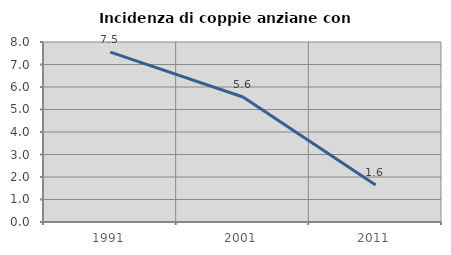
| Category | Incidenza di coppie anziane con figli |
|---|---|
| 1991.0 | 7.547 |
| 2001.0 | 5.556 |
| 2011.0 | 1.639 |